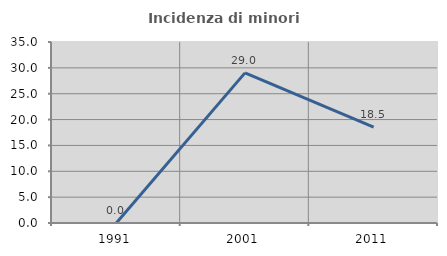
| Category | Incidenza di minori stranieri |
|---|---|
| 1991.0 | 0 |
| 2001.0 | 29.032 |
| 2011.0 | 18.519 |